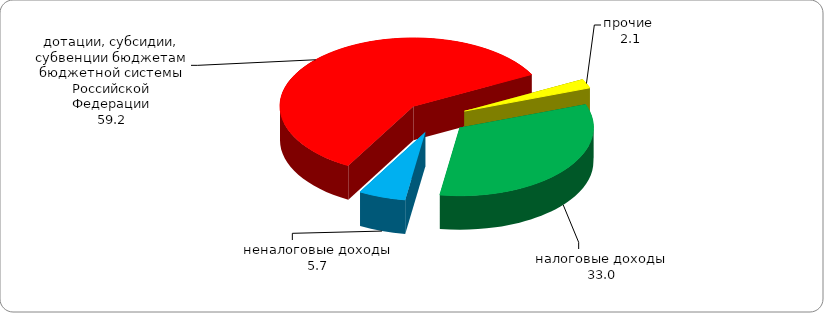
| Category | Series 0 |
|---|---|
| налоговые доходы | 32.956 |
| неналоговые доходы | 5.715 |
| дотации, субсидии, субвенции бюджетам бюджетной системы Российской Федерации | 59.182 |
| прочие  | 2.147 |